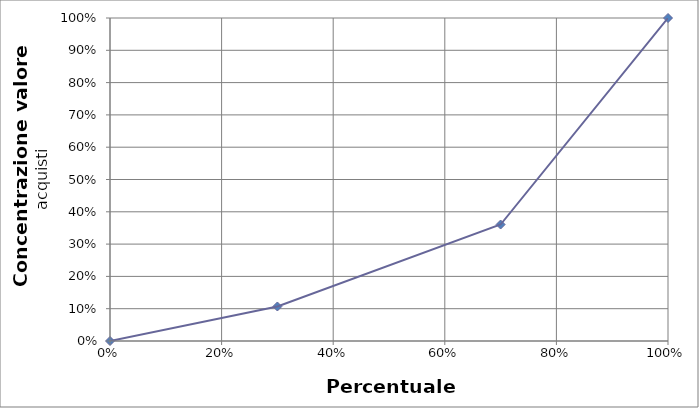
| Category | Acquisti |
|---|---|
| 0.0 | 0 |
| 0.3 | 0.107 |
| 0.7 | 0.361 |
| 1.0 | 1 |